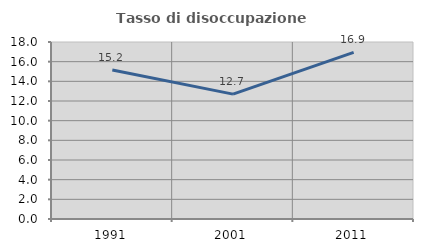
| Category | Tasso di disoccupazione giovanile  |
|---|---|
| 1991.0 | 15.152 |
| 2001.0 | 12.698 |
| 2011.0 | 16.949 |